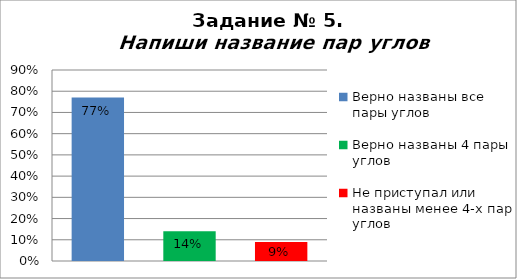
| Category | Напиши название пар углов |
|---|---|
| Верно названы все пары углов | 0.77 |
| Верно названы 4 пары углов | 0.14 |
| Не приступал или названы менее 4-х пар углов | 0.09 |